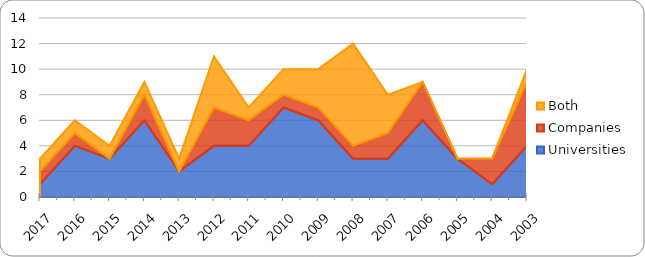
| Category | Universities | Companies | Both |
|---|---|---|---|
| 2017.0 | 1 | 1 | 1 |
| 2016.0 | 4 | 1 | 1 |
| 2015.0 | 3 | 0 | 1 |
| 2014.0 | 6 | 2 | 1 |
| 2013.0 | 2 | 0 | 1 |
| 2012.0 | 4 | 3 | 4 |
| 2011.0 | 4 | 2 | 1 |
| 2010.0 | 7 | 1 | 2 |
| 2009.0 | 6 | 1 | 3 |
| 2008.0 | 3 | 1 | 8 |
| 2007.0 | 3 | 2 | 3 |
| 2006.0 | 6 | 3 | 0 |
| 2005.0 | 3 | 0 | 0 |
| 2004.0 | 1 | 2 | 0 |
| 2003.0 | 4 | 5 | 1 |